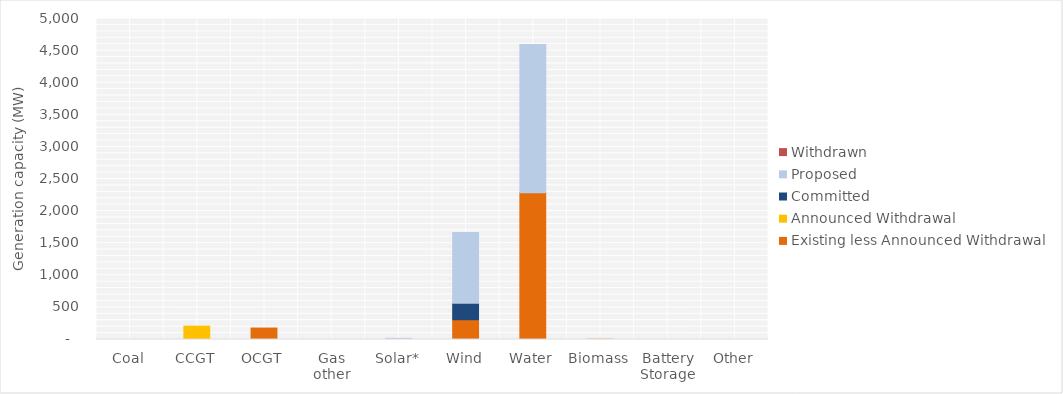
| Category | Existing less Announced Withdrawal | Announced Withdrawal | Committed | Proposed | Withdrawn |
|---|---|---|---|---|---|
| Coal | 0 | 0 | 0 | 0 | 0 |
| CCGT | 0 | 208 | 0 | 0 | 0 |
| OCGT | 178 | 0 | 0 | 0 | 0 |
| Gas other | 0 | 0 | 0 | 0 | 0 |
| Solar* | 0.265 | 0 | 0 | 17.5 | 0 |
| Wind | 308 | 0 | 255.6 | 1102 | 0 |
| Water | 2286.8 | 0 | 0 | 2310 | 0 |
| Biomass | 4.936 | 0 | 0 | 0 | 0 |
| Battery Storage | 0 | 0 | 0 | 0 | 0 |
| Other | 0 | 0 | 0 | 0 | 0 |